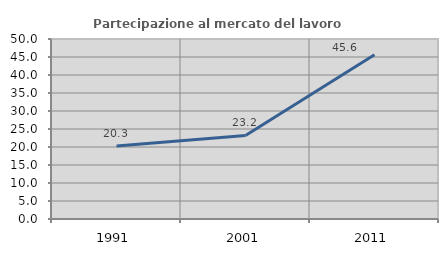
| Category | Partecipazione al mercato del lavoro  femminile |
|---|---|
| 1991.0 | 20.29 |
| 2001.0 | 23.214 |
| 2011.0 | 45.614 |